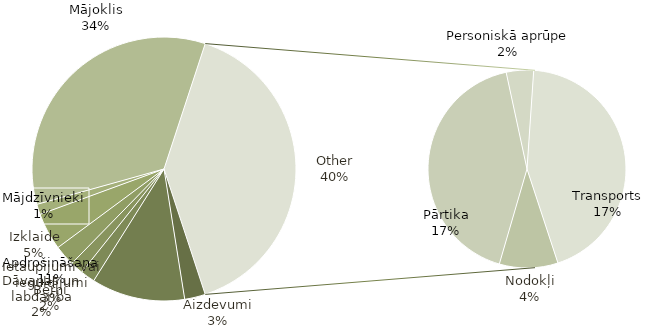
| Category | Kopsumma |
|---|---|
| Aizdevumi | 200 |
| Apdrošināšana | 900 |
| Bērni | 140 |
| Dāvanas un labdarība | 125 |
| Ietaupījumi vai ieguldījumi | 200 |
| Izklaide | 358 |
| Mājdzīvnieki | 100 |
| Mājoklis | 2702 |
| Nodokļi | 300 |
| Pārtika | 1320 |
| Personiskā aprūpe | 140 |
| Transports | 1375 |